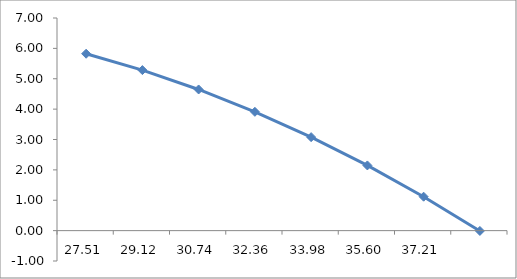
| Category | Series 0 |
|---|---|
| 27.50657780874822 | 5.824 |
| 29.124611797498115 | 5.284 |
| 30.742645786248012 | 4.647 |
| 32.360679774997905 | 3.911 |
| 33.9787137637478 | 3.078 |
| 35.5967477524977 | 2.147 |
| 37.21478174124759 | 1.117 |